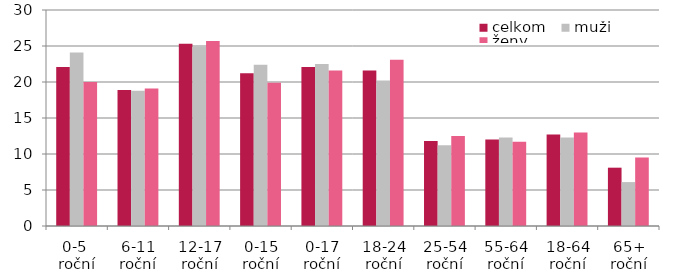
| Category | celkom | muži | ženy |
|---|---|---|---|
| 0-5  roční | 22.1 | 24.1 | 20 |
| 6-11 roční | 18.9 | 18.8 | 19.1 |
| 12-17 roční | 25.3 | 24.9 | 25.7 |
| 0-15 roční | 21.2 | 22.4 | 19.9 |
| 0-17 roční | 22.1 | 22.5 | 21.6 |
| 18-24 roční | 21.6 | 20.2 | 23.1 |
| 25-54 roční | 11.8 | 11.2 | 12.5 |
| 55-64 roční | 12 | 12.3 | 11.7 |
| 18-64 roční | 12.7 | 12.3 | 13 |
| 65+ roční | 8.1 | 6.1 | 9.5 |